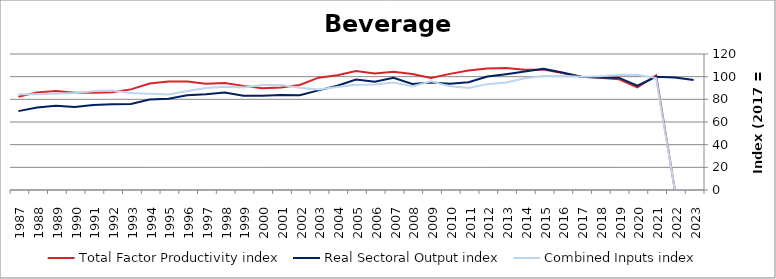
| Category | Total Factor Productivity index | Real Sectoral Output index | Combined Inputs index |
|---|---|---|---|
| 2023.0 | 0 | 96.988 | 0 |
| 2022.0 | 0 | 99.229 | 0 |
| 2021.0 | 101.158 | 99.889 | 98.745 |
| 2020.0 | 90.56 | 92.134 | 101.738 |
| 2019.0 | 97.76 | 99.148 | 101.419 |
| 2018.0 | 98.947 | 99.354 | 100.412 |
| 2017.0 | 100 | 100 | 100 |
| 2016.0 | 103.117 | 103.707 | 100.573 |
| 2015.0 | 106.205 | 106.885 | 100.641 |
| 2014.0 | 106.071 | 104.621 | 98.633 |
| 2013.0 | 107.681 | 102.202 | 94.911 |
| 2012.0 | 107.148 | 100.083 | 93.406 |
| 2011.0 | 105.467 | 95.023 | 90.097 |
| 2010.0 | 102.473 | 93.714 | 91.452 |
| 2009.0 | 98.758 | 94.785 | 95.976 |
| 2008.0 | 102.286 | 93.492 | 91.402 |
| 2007.0 | 104.407 | 98.938 | 94.762 |
| 2006.0 | 102.729 | 95.594 | 93.055 |
| 2005.0 | 105.006 | 97.462 | 92.815 |
| 2004.0 | 101.253 | 92.028 | 90.889 |
| 2003.0 | 99.145 | 87.896 | 88.654 |
| 2002.0 | 92.63 | 83.604 | 90.256 |
| 2001.0 | 90.473 | 83.847 | 92.676 |
| 2000.0 | 89.851 | 83.246 | 92.649 |
| 1999.0 | 91.873 | 83.068 | 90.417 |
| 1998.0 | 94.419 | 86.044 | 91.13 |
| 1997.0 | 93.782 | 84.434 | 90.032 |
| 1996.0 | 95.666 | 83.575 | 87.361 |
| 1995.0 | 95.683 | 80.613 | 84.25 |
| 1994.0 | 93.978 | 79.769 | 84.88 |
| 1993.0 | 88.78 | 75.927 | 85.523 |
| 1992.0 | 86.339 | 75.705 | 87.684 |
| 1991.0 | 85.895 | 74.923 | 87.226 |
| 1990.0 | 85.783 | 73.331 | 85.484 |
| 1989.0 | 87.457 | 74.37 | 85.035 |
| 1988.0 | 86.143 | 72.748 | 84.45 |
| 1987.0 | 82.259 | 69.584 | 84.592 |